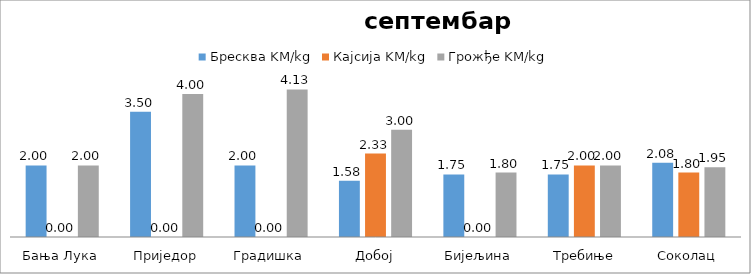
| Category | Бресква KM/kg | Кајсија KM/kg | Грожђе KM/kg |
|---|---|---|---|
| Бања Лука | 2 | 0 | 2 |
| Приједор | 3.5 | 0 | 4 |
| Градишка | 2 | 0 | 4.125 |
| Добој | 1.575 | 2.333 | 3 |
| Бијељина | 1.75 | 0 | 1.8 |
|  Требиње | 1.75 | 2 | 2 |
| Соколац | 2.075 | 1.8 | 1.95 |